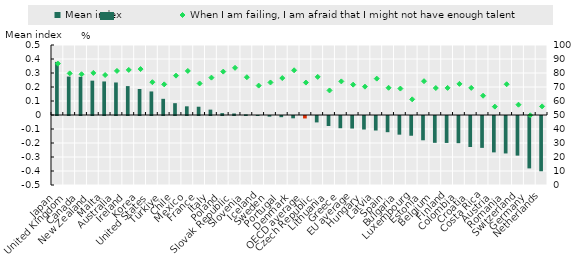
| Category | Mean index |
|---|---|
| Japan | 0.379 |
| United Kingdom | 0.275 |
| Canada | 0.272 |
| New Zealand | 0.245 |
| Malta | 0.24 |
| Australia | 0.232 |
| Ireland | 0.206 |
| Korea | 0.186 |
| United States | 0.168 |
| Türkiye | 0.116 |
| Chile | 0.084 |
| Mexico | 0.062 |
| France | 0.059 |
| Italy | 0.038 |
| Poland | 0.013 |
| Slovak Republic | 0.011 |
| Slovenia | 0.004 |
| Iceland | 0.001 |
| Sweden | -0.005 |
| Portugal | -0.008 |
| Denmark | -0.017 |
| OECD average | -0.017 |
| Czech Republic | -0.046 |
| Lithuania | -0.072 |
| Greece | -0.087 |
| EU average | -0.09 |
| Hungary | -0.097 |
| Latvia | -0.104 |
| Spain | -0.116 |
| Bulgaria | -0.133 |
| Luxembourg | -0.141 |
| Estonia | -0.173 |
| Belgium | -0.192 |
| Finland | -0.192 |
| Colombia | -0.194 |
| Croatia | -0.222 |
| Costa Rica | -0.228 |
| Austria | -0.26 |
| Romania | -0.267 |
| Switzerland | -0.283 |
| Germany | -0.374 |
| Netherlands | -0.395 |